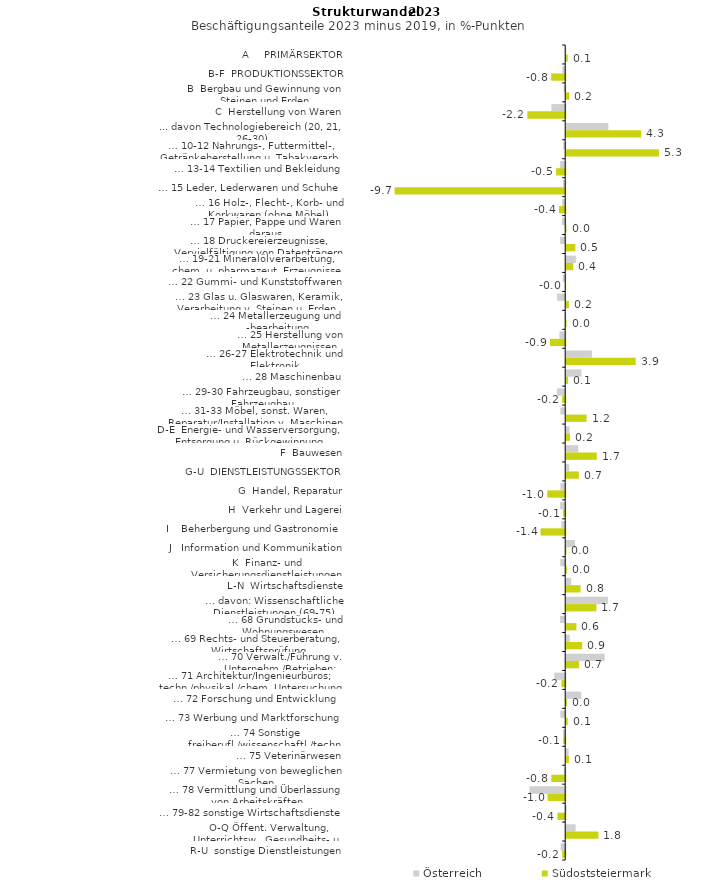
| Category | Österreich | Südoststeiermark |
|---|---|---|
| A     PRIMÄRSEKTOR | -0.007 | 0.084 |
| B-F  PRODUKTIONSSEKTOR | -0.161 | -0.797 |
| B  Bergbau und Gewinnung von Steinen und Erden | -0.086 | 0.179 |
| C  Herstellung von Waren | -0.782 | -2.152 |
| ... davon Technologiebereich (20, 21, 26-30) | 2.393 | 4.254 |
| … 10-12 Nahrungs-, Futtermittel-, Getränkeherstellung u. Tabakverarb. | -0.116 | 5.271 |
| … 13-14 Textilien und Bekleidung | -0.289 | -0.519 |
| … 15 Leder, Lederwaren und Schuhe | -0.13 | -9.694 |
| … 16 Holz-, Flecht-, Korb- und Korkwaren (ohne Möbel)  | -0.177 | -0.352 |
| … 17 Papier, Pappe und Waren daraus  | -0.185 | 0.02 |
| … 18 Druckereierzeugnisse, Vervielfältigung von Datenträgern | -0.288 | 0.52 |
| … 19-21 Mineralölverarbeitung, chem. u. pharmazeut. Erzeugnisse | 0.549 | 0.4 |
| … 22 Gummi- und Kunststoffwaren | -0.139 | -0.014 |
| … 23 Glas u. Glaswaren, Keramik, Verarbeitung v. Steinen u. Erden  | -0.462 | 0.154 |
| … 24 Metallerzeugung und -bearbeitung | -0.032 | 0.025 |
| … 25 Herstellung von Metallerzeugnissen  | -0.325 | -0.862 |
| … 26-27 Elektrotechnik und Elektronik | 1.462 | 3.948 |
| … 28 Maschinenbau | 0.864 | 0.101 |
| … 29-30 Fahrzeugbau, sonstiger Fahrzeugbau | -0.462 | -0.176 |
| … 31-33 Möbel, sonst. Waren, Reparatur/Installation v. Maschinen | -0.273 | 1.158 |
| D-E  Energie- und Wasserversorgung, Entsorgung u. Rückgewinnung | 0.184 | 0.213 |
| F  Bauwesen | 0.684 | 1.738 |
| G-U  DIENSTLEISTUNGSSEKTOR | 0.167 | 0.717 |
| G  Handel, Reparatur | -0.273 | -1.019 |
| H  Verkehr und Lagerei | -0.287 | -0.12 |
| I    Beherbergung und Gastronomie | -0.218 | -1.398 |
| J   Information und Kommunikation | 0.499 | 0.014 |
| K  Finanz- und Versicherungsdienstleistungen | -0.279 | 0.039 |
| L-N  Wirtschaftsdienste | 0.279 | 0.817 |
| … davon: Wissenschaftliche Dienstleistungen (69-75) | 2.367 | 1.712 |
| … 68 Grundstücks- und Wohnungswesen  | -0.294 | 0.579 |
| … 69 Rechts- und Steuerberatung, Wirtschaftsprüfung | 0.205 | 0.909 |
| … 70 Verwalt./Führung v. Unternehm./Betrieben; Unternehmensberat. | 2.188 | 0.733 |
| … 71 Architektur/Ingenieurbüros; techn./physikal./chem. Untersuchung | -0.622 | -0.216 |
| … 72 Forschung und Entwicklung  | 0.854 | 0.049 |
| … 73 Werbung und Marktforschung | -0.273 | 0.086 |
| … 74 Sonstige freiberufl./wissenschaftl./techn. Tätigkeiten | -0.124 | -0.112 |
| … 75 Veterinärwesen | 0.14 | 0.15 |
| … 77 Vermietung von beweglichen Sachen  | -0.077 | -0.786 |
| … 78 Vermittlung und Überlassung von Arbeitskräften | -2.035 | -0.998 |
| … 79-82 sonstige Wirtschaftsdienste | 0.039 | -0.443 |
| O-Q Öffent. Verwaltung, Unterrichtsw., Gesundheits- u. Sozialwesen | 0.535 | 1.834 |
| R-U  sonstige Dienstleistungen | -0.256 | -0.171 |